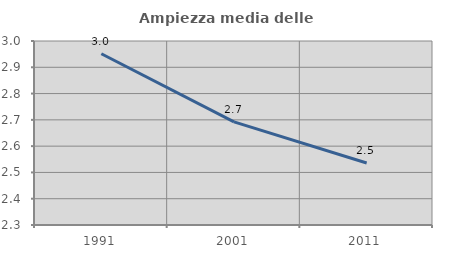
| Category | Ampiezza media delle famiglie |
|---|---|
| 1991.0 | 2.951 |
| 2001.0 | 2.692 |
| 2011.0 | 2.536 |